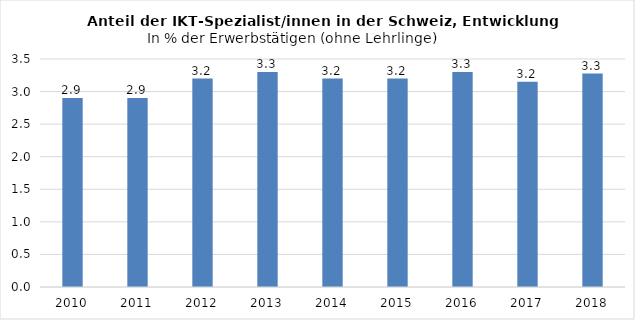
| Category | In % |
|---|---|
| 2010.0 | 2.9 |
| 2011.0 | 2.9 |
| 2012.0 | 3.2 |
| 2013.0 | 3.3 |
| 2014.0 | 3.2 |
| 2015.0 | 3.2 |
| 2016.0 | 3.3 |
| 2017.0 | 3.151 |
| 2018.0 | 3.276 |